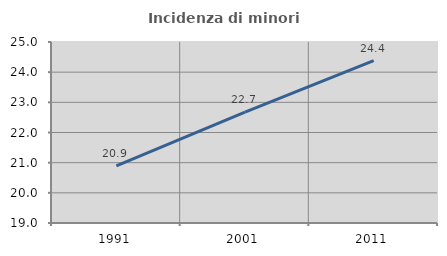
| Category | Incidenza di minori stranieri |
|---|---|
| 1991.0 | 20.896 |
| 2001.0 | 22.677 |
| 2011.0 | 24.384 |